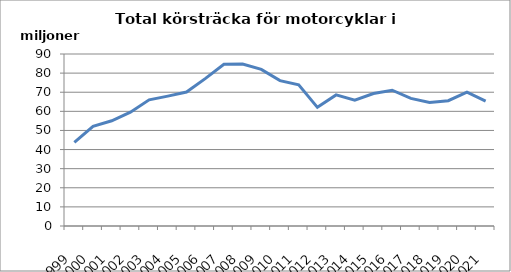
| Category | Series 0 |
|---|---|
| 1999.0 | 43759018.5 |
| 2000.0 | 52181330.9 |
| 2001.0 | 55070560.3 |
| 2002.0 | 59563146.5 |
| 2003.0 | 66034252.2 |
| 2004.0 | 67970980.7 |
| 2005.0 | 70113208.5 |
| 2006.0 | 77125282 |
| 2007.0 | 84622120.1 |
| 2008.0 | 84732017.6 |
| 2009.0 | 81950964.8 |
| 2010.0 | 76081708.7 |
| 2011.0 | 73838792.3 |
| 2012.0 | 62082106 |
| 2013.0 | 68600869.7 |
| 2014.0 | 65803999 |
| 2015.0 | 69320703 |
| 2016.0 | 71066755.4 |
| 2017.0 | 66774567 |
| 2018.0 | 64616300 |
| 2019.0 | 65574115 |
| 2020.0 | 70015396.6 |
| 2021.0 | 65316217.3 |